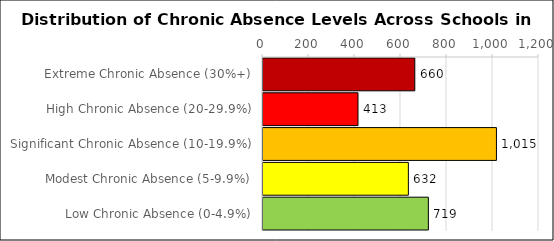
| Category | Number of Schools |
|---|---|
| Extreme Chronic Absence (30%+) | 660 |
| High Chronic Absence (20-29.9%) | 413 |
| Significant Chronic Absence (10-19.9%) | 1015 |
| Modest Chronic Absence (5-9.9%) | 632 |
| Low Chronic Absence (0-4.9%) | 719 |